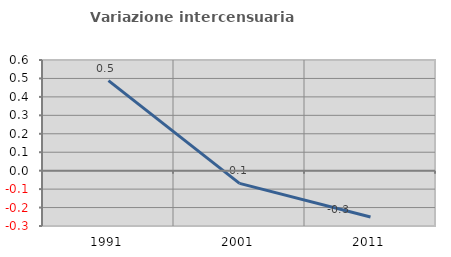
| Category | Variazione intercensuaria annua |
|---|---|
| 1991.0 | 0.488 |
| 2001.0 | -0.069 |
| 2011.0 | -0.251 |